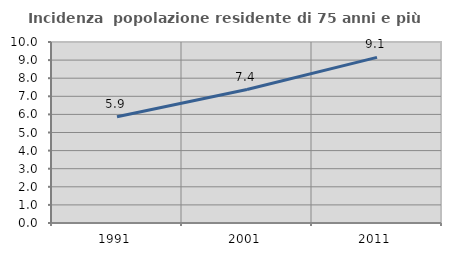
| Category | Incidenza  popolazione residente di 75 anni e più |
|---|---|
| 1991.0 | 5.866 |
| 2001.0 | 7.375 |
| 2011.0 | 9.148 |